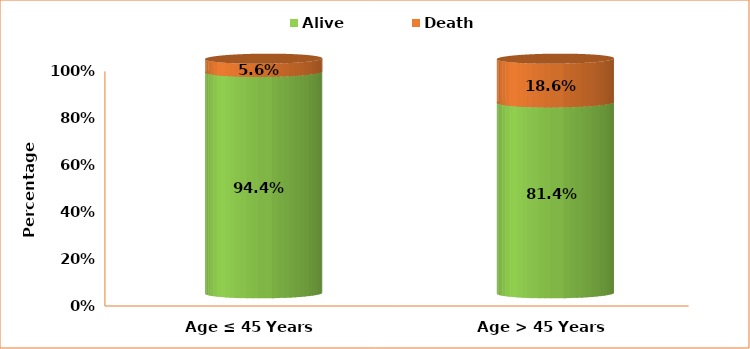
| Category | Alive | Death |
|---|---|---|
| Age ≤ 45 Years | 0.944 | 0.056 |
| Age > 45 Years | 0.814 | 0.186 |